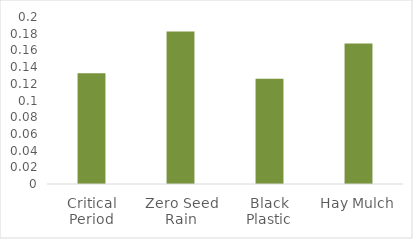
| Category | Non-neg Total |
|---|---|
| Critical Period | 0.133 |
| Zero Seed Rain | 0.183 |
| Black Plastic | 0.126 |
| Hay Mulch | 0.168 |